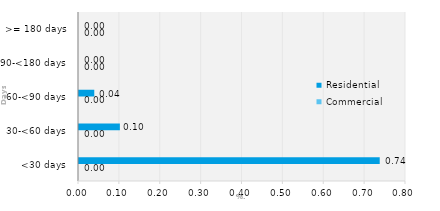
| Category | Commercial | Residential |
|---|---|---|
| <30 days | 0 | 0.736 |
| 30-<60 days | 0 | 0.1 |
| 60-<90 days | 0 | 0.037 |
| 90-<180 days | 0 | 0 |
| >= 180 days | 0 | 0 |